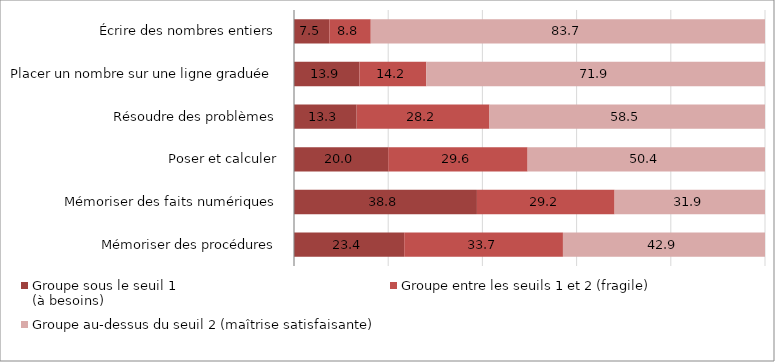
| Category | Groupe sous le seuil 1 
(à besoins) | Groupe entre les seuils 1 et 2 (fragile) | Groupe au-dessus du seuil 2 (maîtrise satisfaisante) |
|---|---|---|---|
| Mémoriser des procédures | 23.4 | 33.7 | 42.9 |
| Mémoriser des faits numériques | 38.8 | 29.2 | 31.9 |
| Poser et calculer | 20 | 29.6 | 50.4 |
| Résoudre des problèmes | 13.3 | 28.2 | 58.5 |
| Placer un nombre sur une ligne graduée | 13.9 | 14.2 | 71.9 |
| Écrire des nombres entiers | 7.5 | 8.8 | 83.7 |